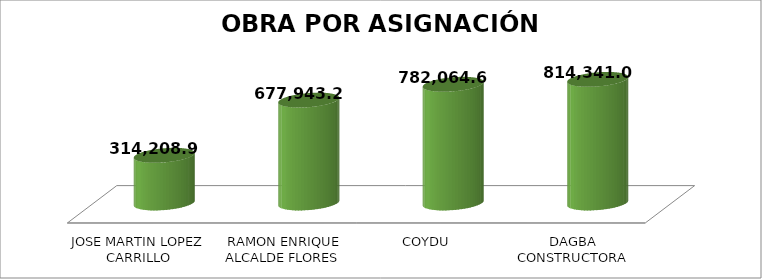
| Category | Monto total |
|---|---|
| JOSE MARTIN LOPEZ CARRILLO | 314208.91 |
| RAMON ENRIQUE ALCALDE FLORES | 677943.24 |
| COYDU | 782064.65 |
| DAGBA CONSTRUCTORA | 814341.07 |